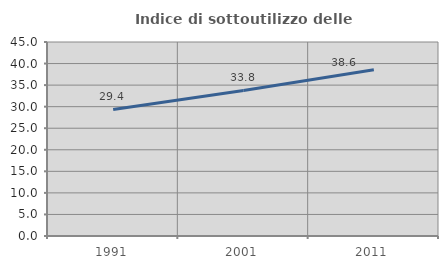
| Category | Indice di sottoutilizzo delle abitazioni  |
|---|---|
| 1991.0 | 29.361 |
| 2001.0 | 33.752 |
| 2011.0 | 38.551 |